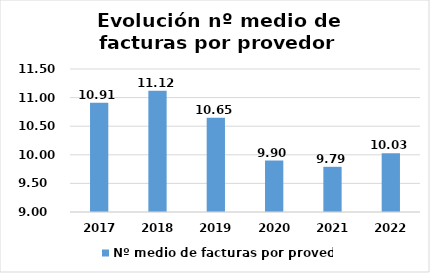
| Category | Nº medio de facturas por provedor |
|---|---|
| 2017.0 | 10.91 |
| 2018.0 | 11.12 |
| 2019.0 | 10.649 |
| 2020.0 | 9.899 |
| 2021.0 | 9.79 |
| 2022.0 | 10.029 |